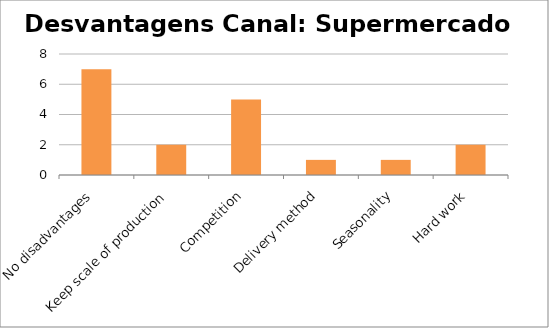
| Category | Series 0 |
|---|---|
| No disadvantages | 7 |
| Keep scale of production | 2 |
| Competition | 5 |
| Delivery method | 1 |
| Seasonality | 1 |
| Hard work | 2 |